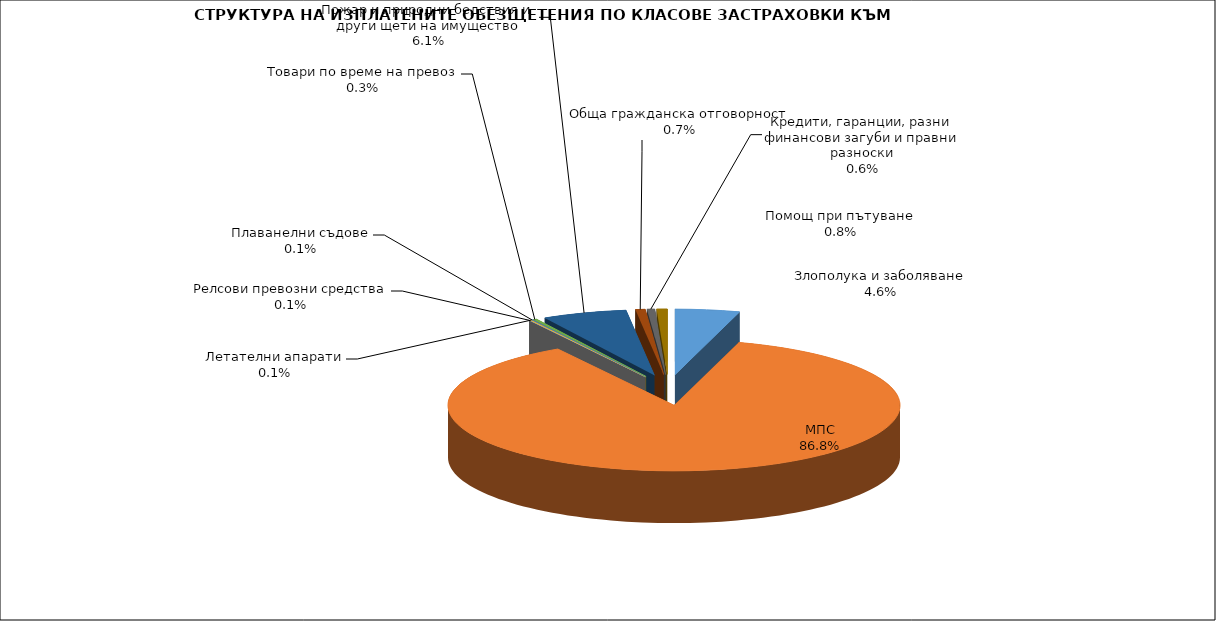
| Category | Series 0 |
|---|---|
| Злополука и заболяване | 0.046 |
| МПС | 0.868 |
| Релсови превозни средства | 0.001 |
| Летателни апарати | 0.001 |
| Плаванелни съдове | 0.001 |
| Товари по време на превоз | 0.003 |
| Пожар и природни бедствия и други щети на имущество | 0.061 |
| Обща гражданска отговорност | 0.007 |
| Кредити, гаранции, разни финансови загуби и правни разноски | 0.006 |
| Помощ при пътуване | 0.008 |